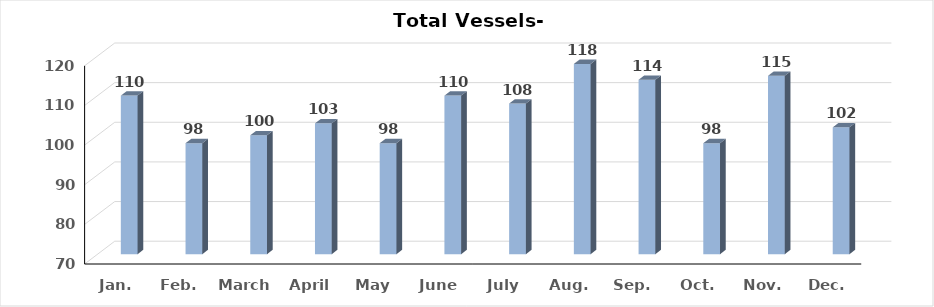
| Category | Series 0 |
|---|---|
| Jan. | 110 |
| Feb. | 98 |
| March | 100 |
| April | 103 |
| May | 98 |
| June | 110 |
| July | 108 |
| Aug. | 118 |
| Sep. | 114 |
| Oct. | 98 |
| Nov. | 115 |
| Dec. | 102 |